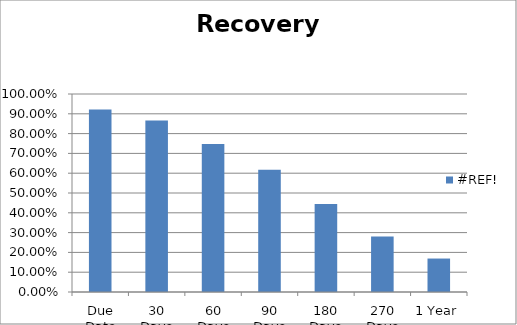
| Category | #REF! |
|---|---|
| Due Date | 0.922 |
| 30 Days | 0.866 |
| 60 Days | 0.748 |
| 90 Days | 0.618 |
| 180 Days | 0.445 |
| 270 Days | 0.28 |
| 1 Year | 0.169 |